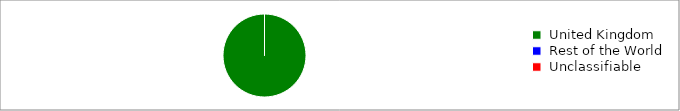
| Category | Series 0 |
|---|---|
|  United Kingdom  | 75939 |
|  Rest of the World  | 0 |
|  Unclassifiable  | 0 |